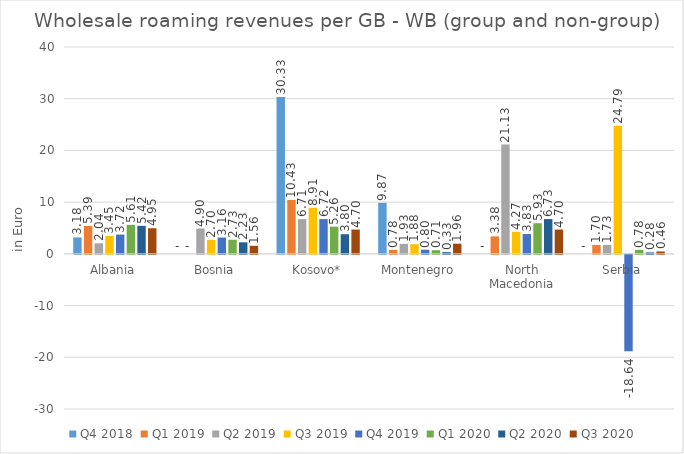
| Category | Q4 2018 | Q1 2019 | Q2 2019 | Q3 2019 | Q4 2019 | Q1 2020 | Q2 2020 | Q3 2020 |
|---|---|---|---|---|---|---|---|---|
| Albania | 3.179 | 5.388 | 2.042 | 3.447 | 3.724 | 5.605 | 5.419 | 4.953 |
| Bosnia | 0 | 0 | 4.903 | 2.698 | 3.16 | 2.729 | 2.232 | 1.559 |
| Kosovo* | 30.334 | 10.434 | 6.715 | 8.914 | 6.725 | 5.261 | 3.797 | 4.701 |
| Montenegro | 9.865 | 0.776 | 1.932 | 1.877 | 0.801 | 0.712 | 0.334 | 1.964 |
| North Macedonia | 0 | 3.382 | 21.128 | 4.274 | 3.831 | 5.925 | 6.725 | 4.701 |
| Serbia | 0 | 1.704 | 1.73 | 24.787 | -18.639 | 0.778 | 0.28 | 0.459 |